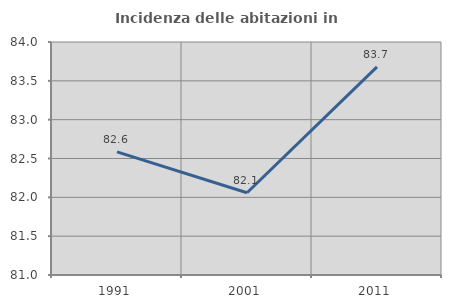
| Category | Incidenza delle abitazioni in proprietà  |
|---|---|
| 1991.0 | 82.586 |
| 2001.0 | 82.059 |
| 2011.0 | 83.68 |